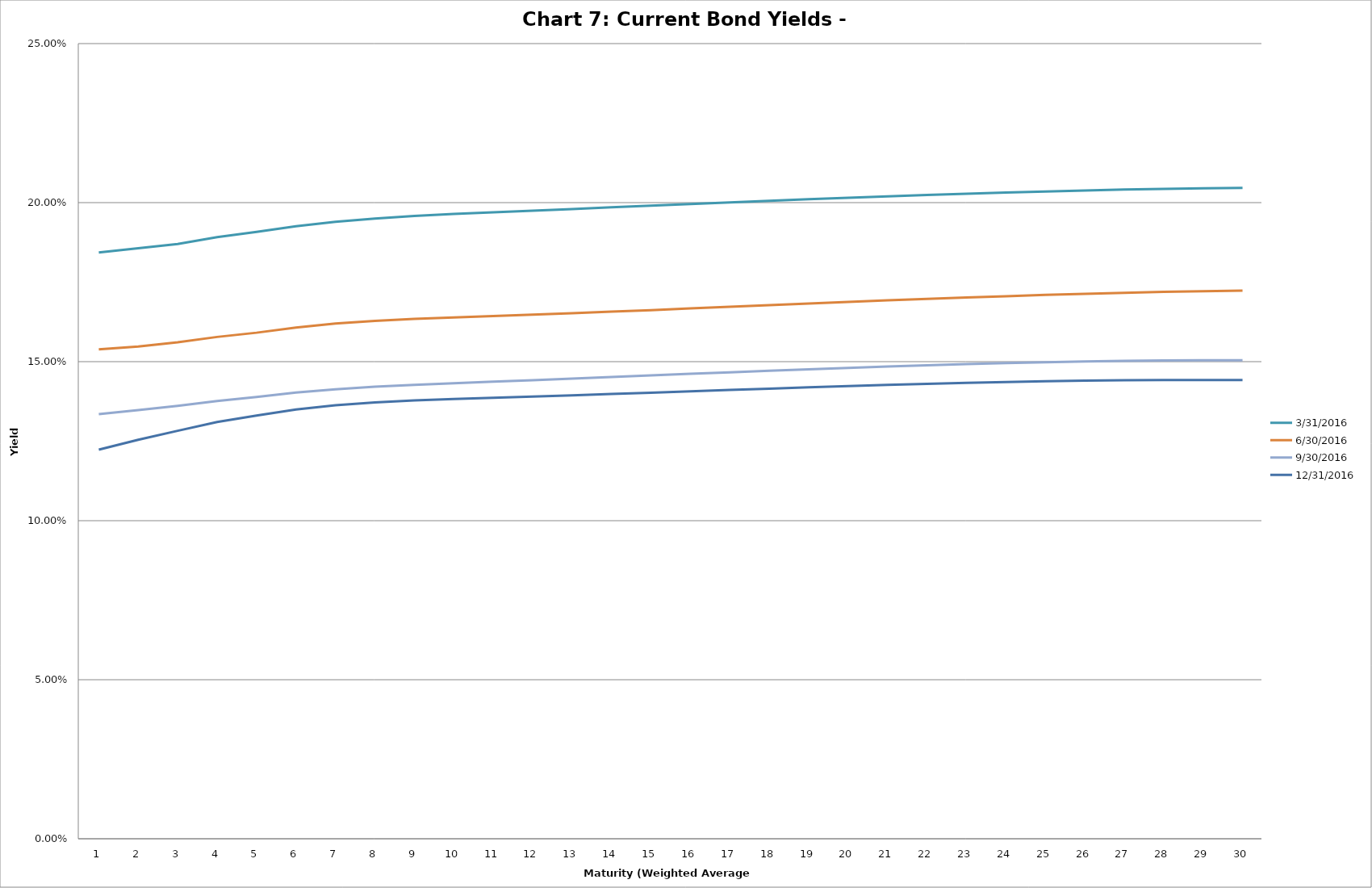
| Category | 3/31/2016 | 6/30/2016 | 9/30/2016 | 12/31/2016 |
|---|---|---|---|---|
| 0 | 0.184 | 0.154 | 0.134 | 0.122 |
| 1 | 0.186 | 0.155 | 0.135 | 0.125 |
| 2 | 0.187 | 0.156 | 0.136 | 0.128 |
| 3 | 0.189 | 0.158 | 0.138 | 0.131 |
| 4 | 0.191 | 0.159 | 0.139 | 0.133 |
| 5 | 0.193 | 0.161 | 0.14 | 0.135 |
| 6 | 0.194 | 0.162 | 0.141 | 0.136 |
| 7 | 0.195 | 0.163 | 0.142 | 0.137 |
| 8 | 0.196 | 0.163 | 0.143 | 0.138 |
| 9 | 0.196 | 0.164 | 0.143 | 0.138 |
| 10 | 0.197 | 0.164 | 0.144 | 0.139 |
| 11 | 0.197 | 0.165 | 0.144 | 0.139 |
| 12 | 0.198 | 0.165 | 0.145 | 0.139 |
| 13 | 0.199 | 0.166 | 0.145 | 0.14 |
| 14 | 0.199 | 0.166 | 0.146 | 0.14 |
| 15 | 0.2 | 0.167 | 0.146 | 0.141 |
| 16 | 0.2 | 0.167 | 0.147 | 0.141 |
| 17 | 0.201 | 0.168 | 0.147 | 0.142 |
| 18 | 0.201 | 0.168 | 0.148 | 0.142 |
| 19 | 0.202 | 0.169 | 0.148 | 0.142 |
| 20 | 0.202 | 0.169 | 0.148 | 0.143 |
| 21 | 0.202 | 0.17 | 0.149 | 0.143 |
| 22 | 0.203 | 0.17 | 0.149 | 0.143 |
| 23 | 0.203 | 0.171 | 0.15 | 0.144 |
| 24 | 0.204 | 0.171 | 0.15 | 0.144 |
| 25 | 0.204 | 0.171 | 0.15 | 0.144 |
| 26 | 0.204 | 0.172 | 0.15 | 0.144 |
| 27 | 0.204 | 0.172 | 0.15 | 0.144 |
| 28 | 0.205 | 0.172 | 0.15 | 0.144 |
| 29 | 0.205 | 0.172 | 0.15 | 0.144 |